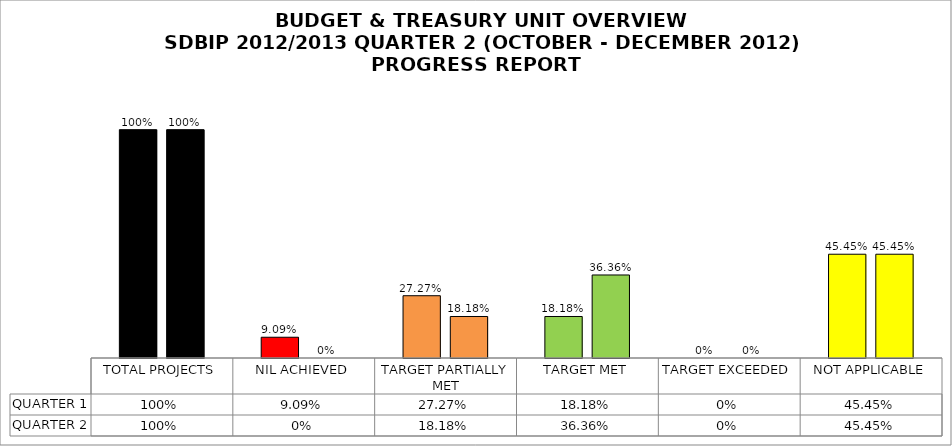
| Category | QUARTER 1 | QUARTER 2 |
|---|---|---|
| TOTAL PROJECTS | 1 | 1 |
| NIL ACHIEVED | 0.091 | 0 |
| TARGET PARTIALLY MET | 0.273 | 0.182 |
| TARGET MET | 0.182 | 0.364 |
| TARGET EXCEEDED | 0 | 0 |
| NOT APPLICABLE | 0.454 | 0.454 |